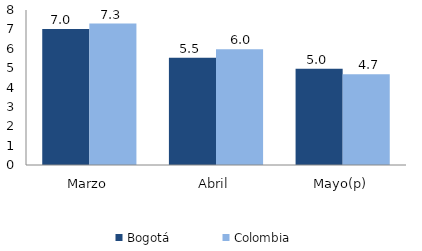
| Category | Bogotá | Colombia |
|---|---|---|
| Marzo | 7.014 | 7.301 |
| Abril | 5.53 | 5.98 |
| Mayo(p) | 4.974 | 4.678 |